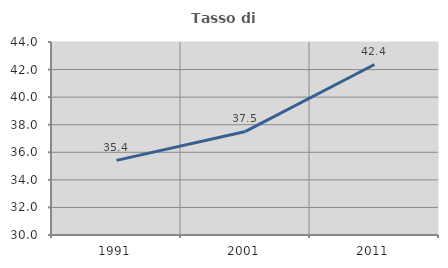
| Category | Tasso di occupazione   |
|---|---|
| 1991.0 | 35.412 |
| 2001.0 | 37.512 |
| 2011.0 | 42.369 |